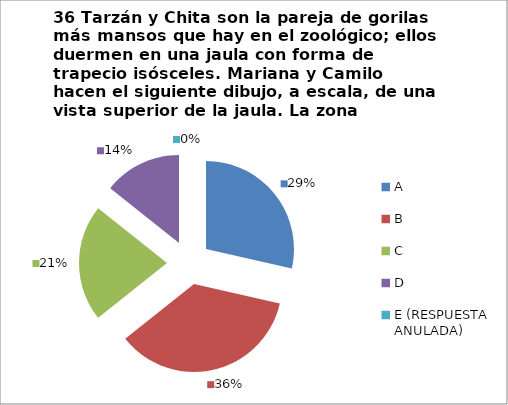
| Category | CANTIDAD DE RESPUESTAS PREGUNTA (36) | PORCENTAJE |
|---|---|---|
| A | 8 | 0.286 |
| B | 10 | 0.357 |
| C | 6 | 0.214 |
| D | 4 | 0.143 |
| E (RESPUESTA ANULADA) | 0 | 0 |